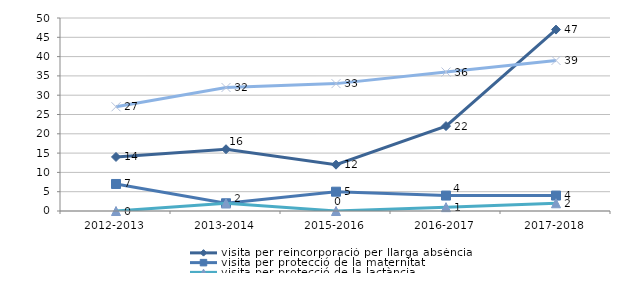
| Category | visita per reincorporació per llarga absència | visita per protecció de la maternitat | visita per protecció de la lactància | visita per motius de salut |
|---|---|---|---|---|
| 2012-2013 | 14 | 7 | 0 | 27 |
| 2013-2014 | 16 | 2 | 2 | 32 |
| 2015-2016 | 12 | 5 | 0 | 33 |
| 2016-2017 | 22 | 4 | 1 | 36 |
| 2017-2018 | 47 | 4 | 2 | 39 |